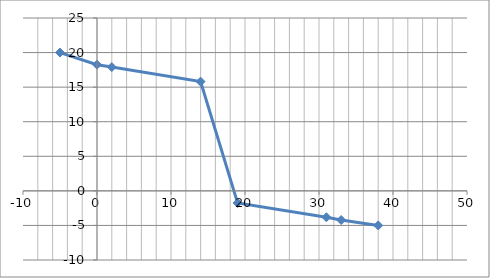
| Category | Series 0 |
|---|---|
| -5.0 | 20 |
| 0.0 | 18.25 |
| 2.0 | 17.9 |
| 14.0 | 15.8 |
| 19.0 | -1.75 |
| 31.0 | -3.82 |
| 33.0 | -4.22 |
| 38.0 | -5 |